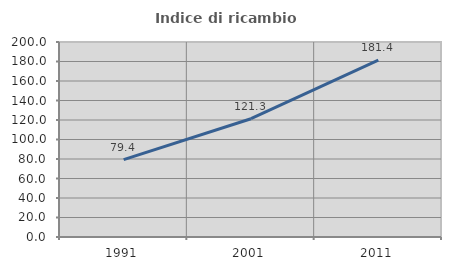
| Category | Indice di ricambio occupazionale  |
|---|---|
| 1991.0 | 79.371 |
| 2001.0 | 121.304 |
| 2011.0 | 181.377 |